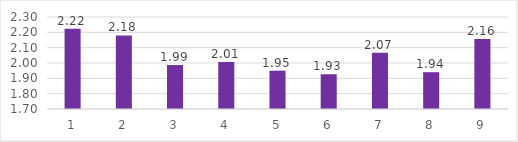
| Category | Series 0 |
|---|---|
| 0 | 2.223 |
| 1 | 2.18 |
| 2 | 1.987 |
| 3 | 2.007 |
| 4 | 1.95 |
| 5 | 1.927 |
| 6 | 2.067 |
| 7 | 1.94 |
| 8 | 2.157 |